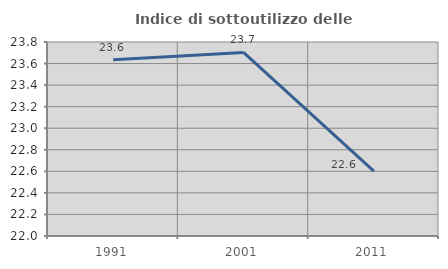
| Category | Indice di sottoutilizzo delle abitazioni  |
|---|---|
| 1991.0 | 23.636 |
| 2001.0 | 23.704 |
| 2011.0 | 22.603 |